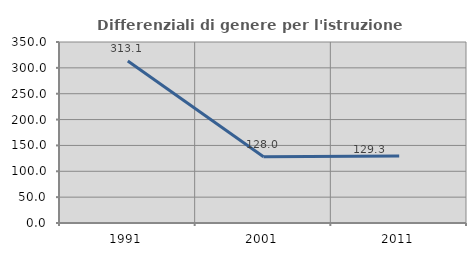
| Category | Differenziali di genere per l'istruzione superiore |
|---|---|
| 1991.0 | 313.109 |
| 2001.0 | 127.951 |
| 2011.0 | 129.324 |